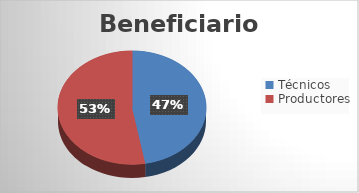
| Category | Series 0 |
|---|---|
| Técnicos | 124 |
| Productores | 139 |